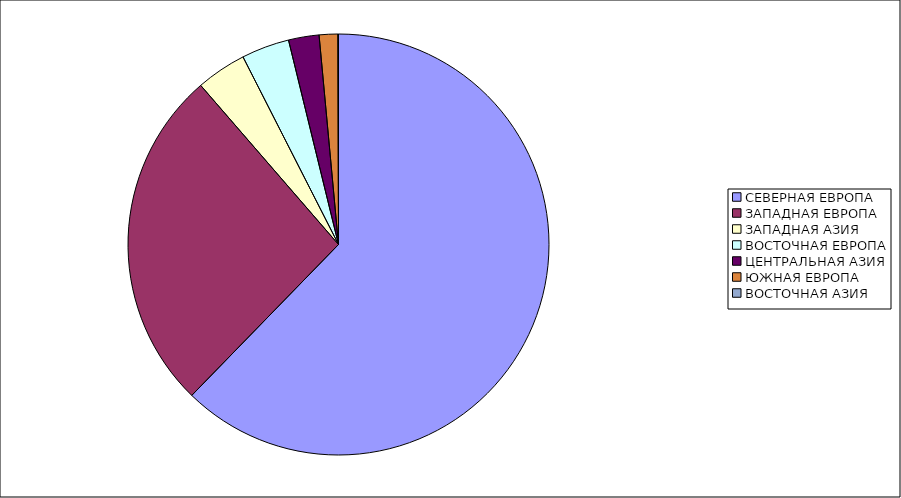
| Category | Оборот |
|---|---|
| СЕВЕРНАЯ ЕВРОПА | 62.278 |
| ЗАПАДНАЯ ЕВРОПА | 26.362 |
| ЗАПАДНАЯ АЗИЯ | 3.865 |
| ВОСТОЧНАЯ ЕВРОПА | 3.678 |
| ЦЕНТРАЛЬНАЯ АЗИЯ | 2.344 |
| ЮЖНАЯ ЕВРОПА | 1.429 |
| ВОСТОЧНАЯ АЗИЯ | 0.045 |